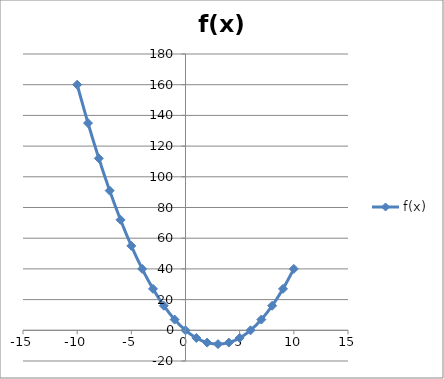
| Category | f(x) |
|---|---|
| -10.0 | 160 |
| -9.0 | 135 |
| -8.0 | 112 |
| -7.0 | 91 |
| -6.0 | 72 |
| -5.0 | 55 |
| -4.0 | 40 |
| -3.0 | 27 |
| -2.0 | 16 |
| -1.0 | 7 |
| 0.0 | 0 |
| 1.0 | -5 |
| 2.0 | -8 |
| 3.0 | -9 |
| 4.0 | -8 |
| 5.0 | -5 |
| 6.0 | 0 |
| 7.0 | 7 |
| 8.0 | 16 |
| 9.0 | 27 |
| 10.0 | 40 |